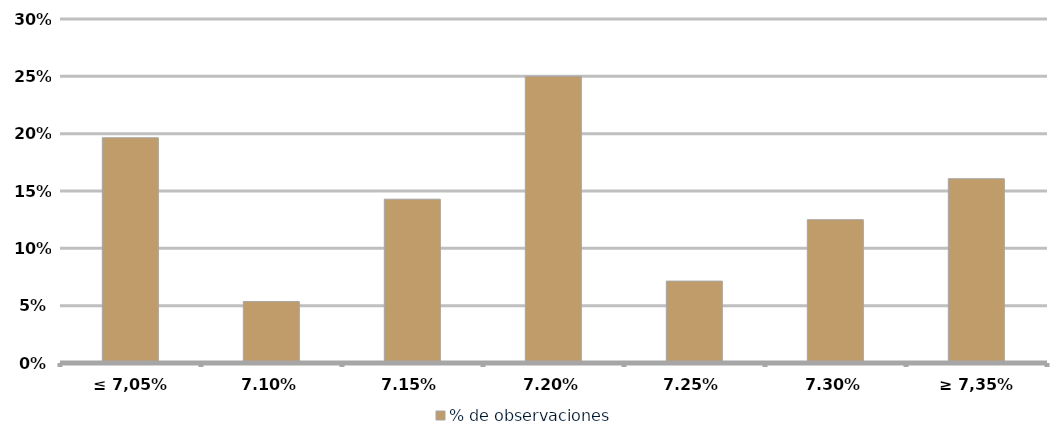
| Category | % de observaciones  |
|---|---|
| ≤ 7,05% | 0.196 |
| 7,10% | 0.054 |
| 7,15% | 0.143 |
| 7,20% | 0.25 |
| 7,25% | 0.071 |
| 7,30% | 0.125 |
| ≥ 7,35% | 0.161 |